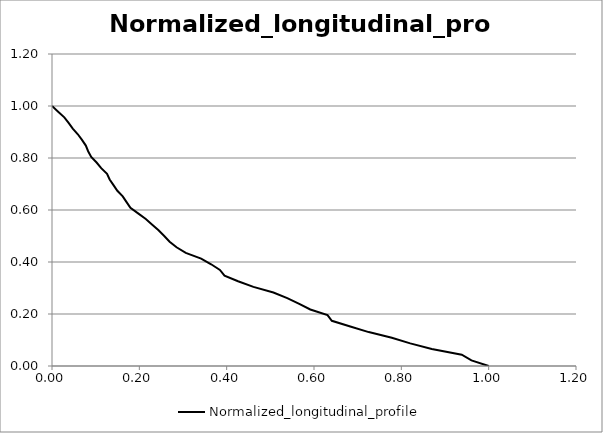
| Category | Normalized_longitudinal_profile |
|---|---|
| 0.0 | 1 |
| 0.014084507042253521 | 0.978 |
| 0.028169014084507043 | 0.957 |
| 0.03802816901408451 | 0.935 |
| 0.04753521126760564 | 0.913 |
| 0.05915492957746479 | 0.891 |
| 0.06866197183098592 | 0.87 |
| 0.07746478873239437 | 0.848 |
| 0.08274647887323944 | 0.826 |
| 0.0897887323943662 | 0.804 |
| 0.10211267605633803 | 0.783 |
| 0.11267605633802817 | 0.761 |
| 0.126056338028169 | 0.739 |
| 0.13204225352112678 | 0.717 |
| 0.14084507042253522 | 0.696 |
| 0.14964788732394366 | 0.674 |
| 0.1619718309859155 | 0.652 |
| 0.17077464788732394 | 0.63 |
| 0.1795774647887324 | 0.609 |
| 0.1971830985915493 | 0.587 |
| 0.21478873239436622 | 0.565 |
| 0.22957746478873242 | 0.543 |
| 0.24401408450704226 | 0.522 |
| 0.25704225352112675 | 0.5 |
| 0.2693661971830986 | 0.478 |
| 0.2852112676056338 | 0.457 |
| 0.3063380281690141 | 0.435 |
| 0.3415492957746479 | 0.413 |
| 0.3644366197183099 | 0.391 |
| 0.38450704225352117 | 0.37 |
| 0.39507042253521135 | 0.348 |
| 0.426056338028169 | 0.326 |
| 0.46126760563380287 | 0.304 |
| 0.5070422535211268 | 0.283 |
| 0.5387323943661972 | 0.261 |
| 0.5661971830985916 | 0.239 |
| 0.5915492957746479 | 0.217 |
| 0.6309859154929578 | 0.196 |
| 0.6408450704225352 | 0.174 |
| 0.6830985915492958 | 0.152 |
| 0.7253521126760564 | 0.13 |
| 0.7781690140845071 | 0.109 |
| 0.8204225352112676 | 0.087 |
| 0.869718309859155 | 0.065 |
| 0.9383802816901409 | 0.043 |
| 0.9605633802816903 | 0.022 |
| 1.0 | 0 |